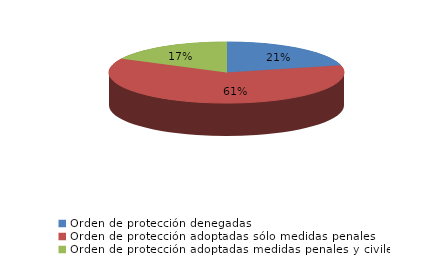
| Category | Series 0 |
|---|---|
| Orden de protección denegadas | 57 |
| Orden de protección adoptadas sólo medidas penales | 165 |
| Orden de protección adoptadas medidas penales y civiles | 47 |